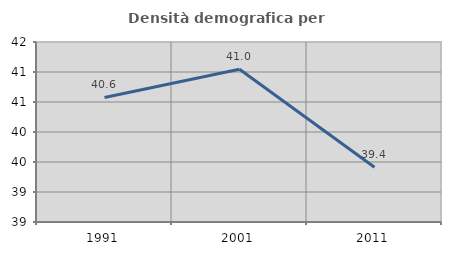
| Category | Densità demografica |
|---|---|
| 1991.0 | 40.575 |
| 2001.0 | 41.047 |
| 2011.0 | 39.411 |